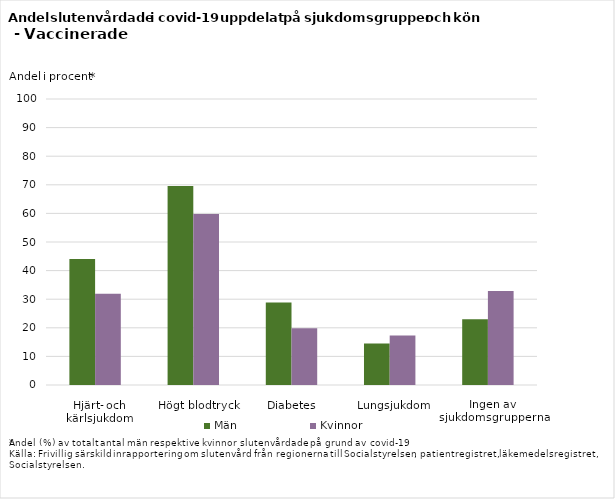
| Category | Män | Kvinnor |
|---|---|---|
| Hjärt- och kärlsjukdom | 44.034 | 31.936 |
| Högt blodtryck | 69.597 | 59.794 |
| Diabetes | 28.803 | 19.879 |
| Lungsjukdom | 14.48 | 17.346 |
| Ingen av sjukdomsgrupperna | 23.015 | 32.9 |